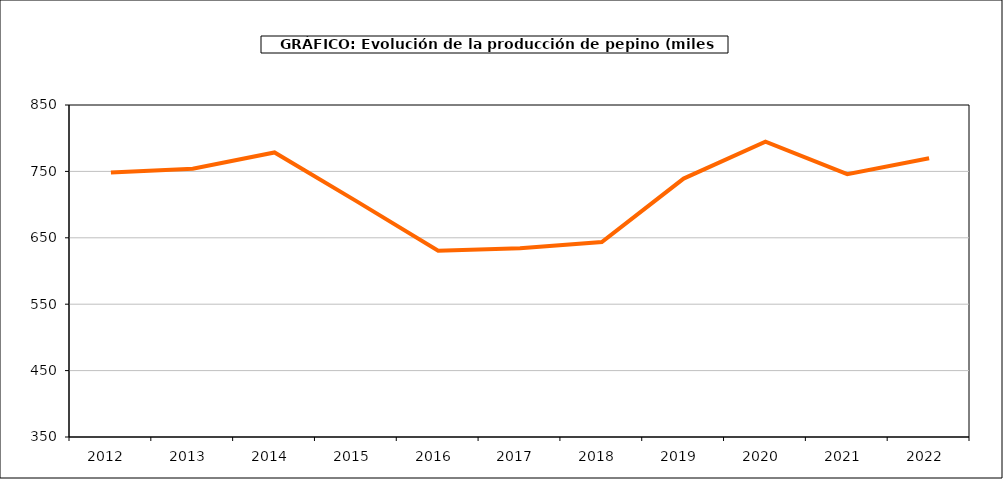
| Category | producción |
|---|---|
| 2012.0 | 748.5 |
| 2013.0 | 753.941 |
| 2014.0 | 778.571 |
| 2015.0 | 705.223 |
| 2016.0 | 630.525 |
| 2017.0 | 634.43 |
| 2018.0 | 643.621 |
| 2019.0 | 739.165 |
| 2020.0 | 794.867 |
| 2021.0 | 745.861 |
| 2022.0 | 769.905 |